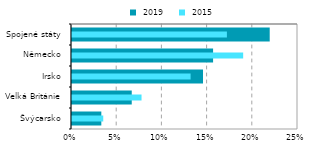
| Category |  2019 |
|---|---|
| Švýcarsko | 0.032 |
| Velká Británie | 0.066 |
| Irsko | 0.145 |
| Německo | 0.156 |
| Spojené státy | 0.219 |